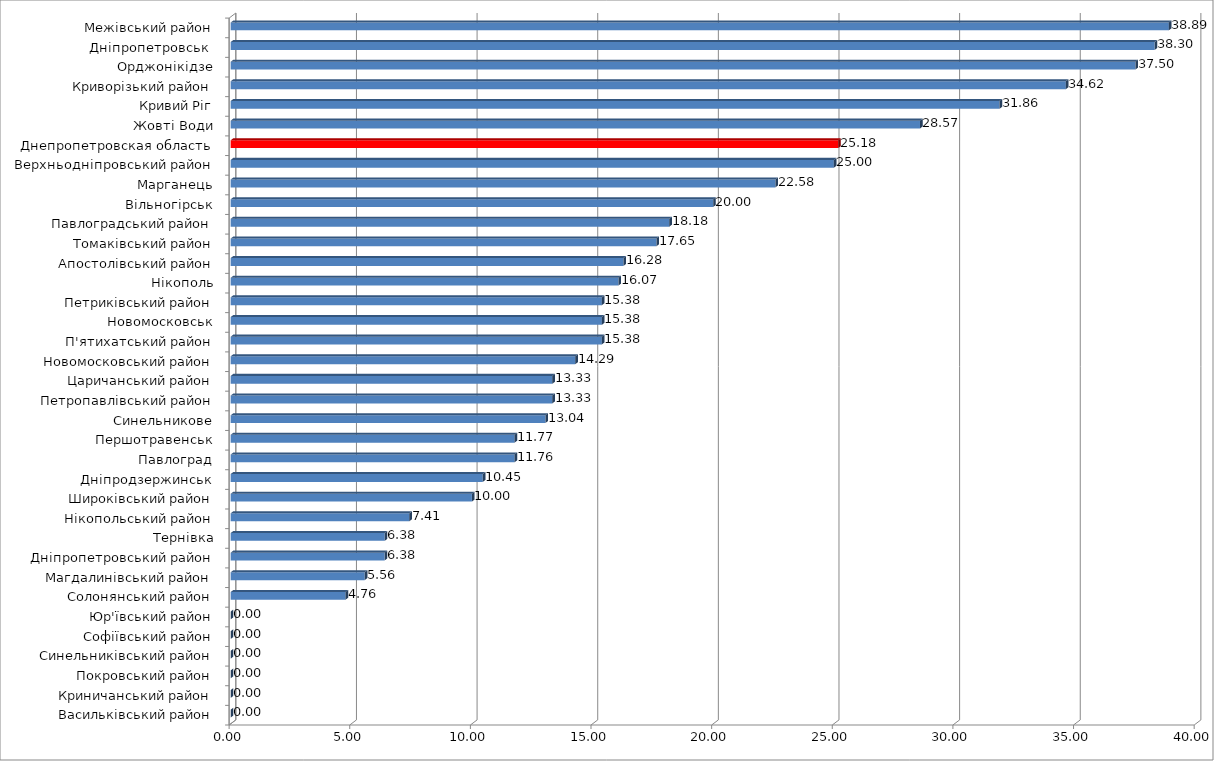
| Category | Series 0 |
|---|---|
| Васильківський район | 0 |
| Криничанський район | 0 |
| Покровський район | 0 |
| Синельниківський район | 0 |
| Софіївський район | 0 |
| Юр'ївський район | 0 |
| Солонянський район | 4.761 |
| Магдалинівський район | 5.556 |
| Дніпропетровський район | 6.382 |
| Тернівка | 6.384 |
| Нікопольський район | 7.407 |
| Широківський район | 10 |
| Дніпродзержинськ | 10.448 |
| Павлоград | 11.765 |
| Першотравенськ | 11.766 |
| Синельникове | 13.045 |
| Петропавлівський район | 13.333 |
| Царичанський район | 13.333 |
| Новомосковський район | 14.286 |
| П'ятихатський район | 15.383 |
| Новомосковськ | 15.385 |
| Петриківський район | 15.385 |
| Нікополь | 16.071 |
| Апостолівський район | 16.28 |
| Томаківський район | 17.646 |
| Павлоградський район | 18.182 |
| Вільногірськ | 19.999 |
| Марганець | 22.58 |
| Верхньодніпровський район | 25 |
| Днепропетровская область | 25.181 |
| Жовті Води | 28.571 |
| Кривий Ріг | 31.865 |
| Криворізький район | 34.615 |
| Орджонікідзе | 37.5 |
| Дніпропетровськ  | 38.298 |
| Межівський район | 38.887 |